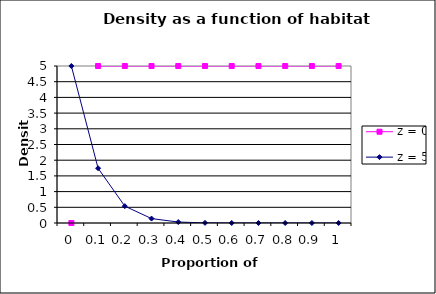
| Category | z = 0 | z = 5 |
|---|---|---|
| 0.0 | 0 | 5 |
| 0.1 | 5 | 1.743 |
| 0.2 | 5 | 0.537 |
| 0.30000000000000004 | 5 | 0.141 |
| 0.4 | 5 | 0.03 |
| 0.5 | 5 | 0.005 |
| 0.6 | 5 | 0.001 |
| 0.7 | 5 | 0 |
| 0.7999999999999999 | 5 | 0 |
| 0.8999999999999999 | 5 | 0 |
| 0.9999999999999999 | 5 | 0 |